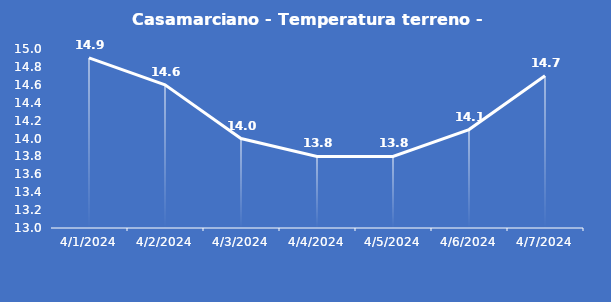
| Category | Casamarciano - Temperatura terreno - Grezzo (°C) |
|---|---|
| 4/1/24 | 14.9 |
| 4/2/24 | 14.6 |
| 4/3/24 | 14 |
| 4/4/24 | 13.8 |
| 4/5/24 | 13.8 |
| 4/6/24 | 14.1 |
| 4/7/24 | 14.7 |